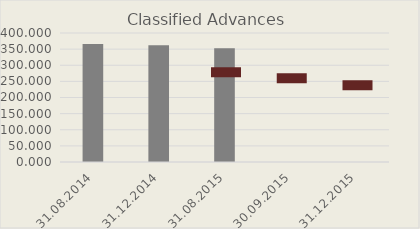
| Category | Classified Advances |
|---|---|
| 31.08.2014 | 365.632 |
| 31.12.2014 | 361.963 |
| 31.08.2015 | 352.939 |
| 30.09.2015 | 0 |
| 31.12.2015 | 0 |